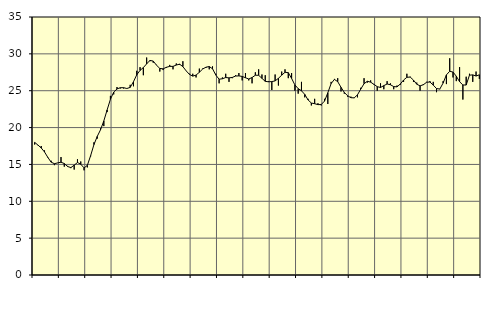
| Category | Piggar | Series 1 |
|---|---|---|
| nan | 17.7 | 17.99 |
| 87.0 | 17.6 | 17.63 |
| 87.0 | 17.5 | 17.23 |
| 87.0 | 16.9 | 16.69 |
| nan | 15.9 | 15.96 |
| 88.0 | 15.5 | 15.31 |
| 88.0 | 14.9 | 15.1 |
| 88.0 | 15.2 | 15.21 |
| nan | 16 | 15.3 |
| 89.0 | 14.7 | 15.12 |
| 89.0 | 14.8 | 14.72 |
| 89.0 | 14.5 | 14.57 |
| nan | 14.3 | 14.9 |
| 90.0 | 15.7 | 15.26 |
| 90.0 | 15.4 | 15.03 |
| 90.0 | 14.2 | 14.53 |
| nan | 14.6 | 14.87 |
| 91.0 | 16.1 | 16.2 |
| 91.0 | 18 | 17.69 |
| 91.0 | 18.5 | 18.8 |
| nan | 19.9 | 19.7 |
| 92.0 | 20.2 | 20.9 |
| 92.0 | 22.1 | 22.39 |
| 92.0 | 24.3 | 23.83 |
| nan | 24.5 | 24.81 |
| 93.0 | 25.5 | 25.24 |
| 93.0 | 25.3 | 25.41 |
| 93.0 | 25.3 | 25.41 |
| nan | 25.3 | 25.3 |
| 94.0 | 25.8 | 25.45 |
| 94.0 | 25.6 | 26.22 |
| 94.0 | 27.7 | 27.16 |
| nan | 28.2 | 27.76 |
| 95.0 | 27.1 | 28.14 |
| 95.0 | 29.5 | 28.64 |
| 95.0 | 29 | 29.11 |
| nan | 28.8 | 29.02 |
| 96.0 | 28.5 | 28.46 |
| 96.0 | 27.6 | 28.02 |
| 96.0 | 27.8 | 27.97 |
| nan | 28.1 | 28.18 |
| 97.0 | 28.5 | 28.3 |
| 97.0 | 27.9 | 28.3 |
| 97.0 | 28.7 | 28.48 |
| nan | 28.5 | 28.6 |
| 98.0 | 29 | 28.27 |
| 98.0 | 27.7 | 27.69 |
| 98.0 | 27.3 | 27.21 |
| nan | 27.3 | 26.98 |
| 99.0 | 26.8 | 27.12 |
| 99.0 | 28 | 27.5 |
| 99.0 | 28 | 27.94 |
| nan | 28.1 | 28.19 |
| 0.0 | 27.9 | 28.28 |
| 0.0 | 28.3 | 27.98 |
| 0.0 | 27.3 | 27.12 |
| nan | 26 | 26.56 |
| 1.0 | 26.8 | 26.62 |
| 1.0 | 27.3 | 26.79 |
| 1.0 | 26.2 | 26.74 |
| nan | 26.7 | 26.8 |
| 2.0 | 27.1 | 26.99 |
| 2.0 | 27.4 | 27.01 |
| 2.0 | 26.4 | 26.94 |
| nan | 27.4 | 26.76 |
| 3.0 | 26.4 | 26.59 |
| 3.0 | 26 | 26.79 |
| 3.0 | 27.5 | 27.1 |
| nan | 27.9 | 27.09 |
| 4.0 | 27.2 | 26.68 |
| 4.0 | 27.1 | 26.27 |
| 4.0 | 26.3 | 26.21 |
| nan | 25.1 | 26.24 |
| 5.0 | 27.2 | 26.33 |
| 5.0 | 25.7 | 26.68 |
| 5.0 | 27.6 | 27.11 |
| nan | 27.9 | 27.5 |
| 6.0 | 26.7 | 27.45 |
| 6.0 | 27.4 | 26.67 |
| 6.0 | 25 | 25.79 |
| nan | 24.6 | 25.28 |
| 7.0 | 26.2 | 24.99 |
| 7.0 | 24.1 | 24.5 |
| 7.0 | 23.9 | 23.75 |
| nan | 23 | 23.33 |
| 8.0 | 23.9 | 23.24 |
| 8.0 | 23.3 | 23.11 |
| 8.0 | 23 | 23.13 |
| nan | 23.9 | 23.59 |
| 9.0 | 23.2 | 24.72 |
| 9.0 | 26.2 | 25.97 |
| 9.0 | 26.6 | 26.53 |
| nan | 26.7 | 26.23 |
| 10.0 | 24.9 | 25.46 |
| 10.0 | 24.6 | 24.77 |
| 10.0 | 24.2 | 24.32 |
| nan | 24.2 | 24.05 |
| 11.0 | 24 | 24.03 |
| 11.0 | 24.1 | 24.44 |
| 11.0 | 25.4 | 25.22 |
| nan | 26.7 | 25.95 |
| 12.0 | 26.1 | 26.28 |
| 12.0 | 26.4 | 26.16 |
| 12.0 | 25.8 | 25.86 |
| nan | 25 | 25.55 |
| 13.0 | 26 | 25.44 |
| 13.0 | 25.2 | 25.69 |
| 13.0 | 26.3 | 25.91 |
| nan | 26 | 25.81 |
| 14.0 | 25.2 | 25.56 |
| 14.0 | 25.7 | 25.52 |
| 14.0 | 25.8 | 25.91 |
| nan | 26.2 | 26.45 |
| 15.0 | 27.3 | 26.82 |
| 15.0 | 26.9 | 26.85 |
| 15.0 | 26.2 | 26.44 |
| nan | 26.1 | 25.88 |
| 16.0 | 25 | 25.66 |
| 16.0 | 25.9 | 25.81 |
| 16.0 | 26.2 | 26.15 |
| nan | 26.3 | 26.18 |
| 17.0 | 26.2 | 25.76 |
| 17.0 | 24.8 | 25.29 |
| 17.0 | 25.2 | 25.23 |
| nan | 26.3 | 26.04 |
| 18.0 | 25.9 | 27.15 |
| 18.0 | 29.4 | 27.64 |
| 18.0 | 26.8 | 27.53 |
| nan | 26.3 | 26.97 |
| 19.0 | 28.2 | 26.22 |
| 19.0 | 23.8 | 25.78 |
| 19.0 | 26.9 | 25.77 |
| nan | 27.3 | 27.11 |
| 20.0 | 26.2 | 27.15 |
| 20.0 | 27.6 | 26.99 |
| 20.0 | 26.6 | 27.16 |